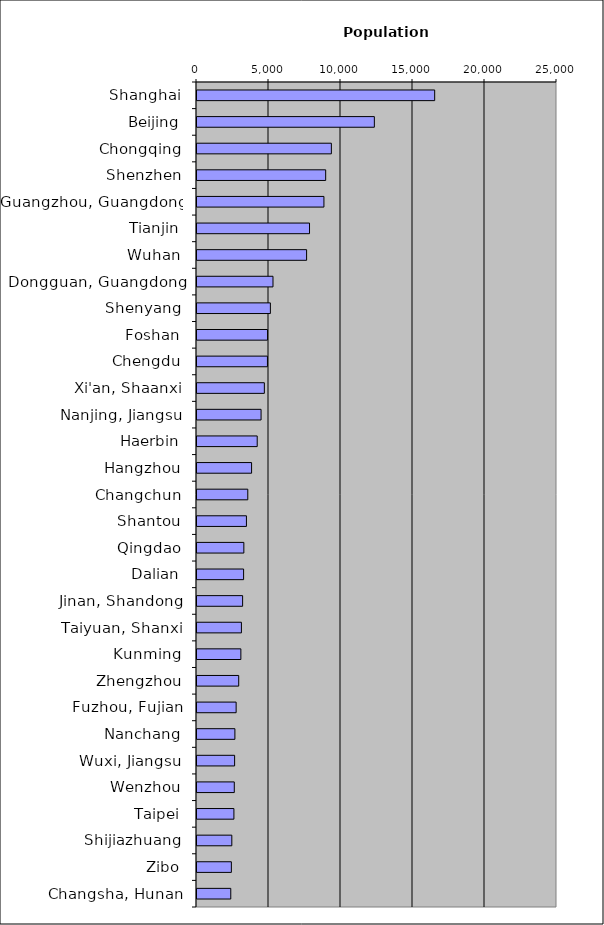
| Category | Series 0 |
|---|---|
| Shanghai | 16575 |
| Beijing | 12385 |
| Chongqing | 9401 |
| Shenzhen | 9005 |
| Guangzhou, Guangdong | 8884 |
| Tianjin | 7884 |
| Wuhan | 7681 |
| Dongguan, Guangdong | 5347 |
| Shenyang | 5166 |
| Foshan | 4969 |
| Chengdu | 4961 |
| Xi'an, Shaanxi | 4747 |
| Nanjing, Jiangsu | 4519 |
| Haerbin | 4251 |
| Hangzhou | 3860 |
| Changchun | 3597 |
| Shantou | 3502 |
| Qingdao | 3323 |
| Dalian | 3306 |
| Jinan, Shandong | 3237 |
| Taiyuan, Shanxi | 3154 |
| Kunming | 3116 |
| Zhengzhou | 2966 |
| Fuzhou, Fujian | 2787 |
| Nanchang | 2701 |
| Wuxi, Jiangsu | 2682 |
| Wenzhou | 2659 |
| Taipei | 2633 |
| Shijiazhuang | 2487 |
| Zibo | 2456 |
| Changsha, Hunan | 2415 |